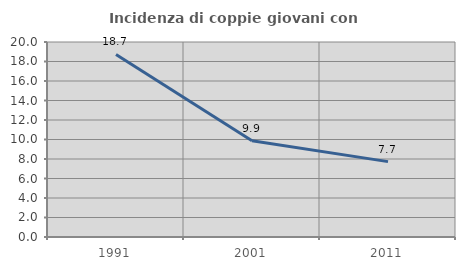
| Category | Incidenza di coppie giovani con figli |
|---|---|
| 1991.0 | 18.722 |
| 2001.0 | 9.867 |
| 2011.0 | 7.731 |